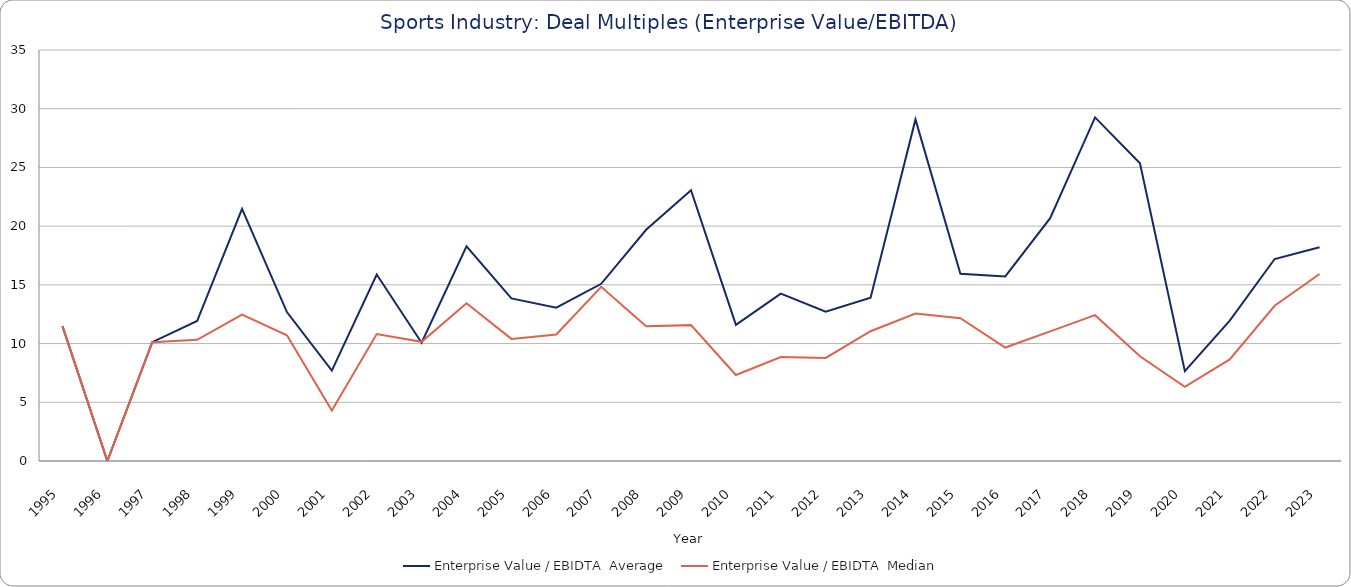
| Category | Enterprise Value / EBIDTA  |
|---|---|
| 1995 | 11.49 |
| 1996 | 0 |
| 1997 | 10.12 |
| 1998 | 10.32 |
| 1999 | 12.47 |
| 2000 | 10.71 |
| 2001 | 4.3 |
| 2002 | 10.81 |
| 2003 | 10.15 |
| 2004 | 13.43 |
| 2005 | 10.4 |
| 2006 | 10.77 |
| 2007 | 14.83 |
| 2008 | 11.48 |
| 2009 | 11.57 |
| 2010 | 7.32 |
| 2011 | 8.85 |
| 2012 | 8.78 |
| 2013 | 11.05 |
| 2014 | 12.56 |
| 2015 | 12.16 |
| 2016 | 9.66 |
| 2017 | 11.04 |
| 2018 | 12.42 |
| 2019 | 8.92 |
| 2020 | 6.31 |
| 2021 | 8.65 |
| 2022 | 13.22 |
| 2023 | 15.92 |